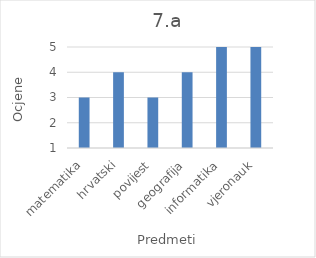
| Category |     7.a |
|---|---|
|  matematika | 3 |
|       hrvatski | 4 |
|        povijest | 3 |
|    geografija | 4 |
|   informatika | 5 |
|     vjeronauk | 5 |